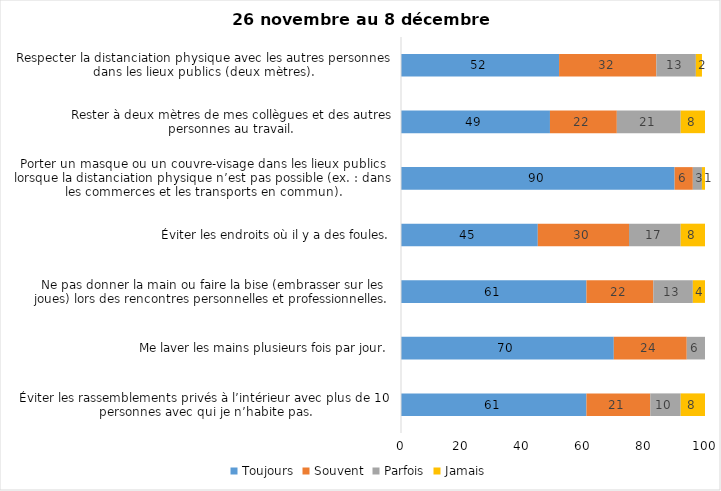
| Category | Toujours | Souvent | Parfois | Jamais |
|---|---|---|---|---|
| Éviter les rassemblements privés à l’intérieur avec plus de 10 personnes avec qui je n’habite pas. | 61 | 21 | 10 | 8 |
| Me laver les mains plusieurs fois par jour. | 70 | 24 | 6 | 0 |
| Ne pas donner la main ou faire la bise (embrasser sur les joues) lors des rencontres personnelles et professionnelles. | 61 | 22 | 13 | 4 |
| Éviter les endroits où il y a des foules. | 45 | 30 | 17 | 8 |
| Porter un masque ou un couvre-visage dans les lieux publics lorsque la distanciation physique n’est pas possible (ex. : dans les commerces et les transports en commun). | 90 | 6 | 3 | 1 |
| Rester à deux mètres de mes collègues et des autres personnes au travail. | 49 | 22 | 21 | 8 |
| Respecter la distanciation physique avec les autres personnes dans les lieux publics (deux mètres). | 52 | 32 | 13 | 2 |